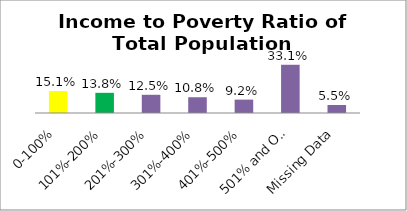
| Category | Percent |
|---|---|
| 0-100% | 0.151 |
| 101%-200% | 0.138 |
| 201%-300% | 0.125 |
| 301%-400% | 0.108 |
| 401%-500% | 0.092 |
| 501% and Over | 0.331 |
| Missing Data | 0.055 |